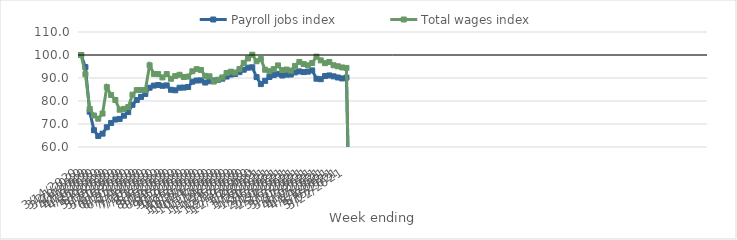
| Category | Payroll jobs index | Total wages index |
|---|---|---|
| 14/03/2020 | 100 | 100 |
| 21/03/2020 | 94.737 | 91.642 |
| 28/03/2020 | 75.344 | 76.601 |
| 04/04/2020 | 67.303 | 73.693 |
| 11/04/2020 | 64.792 | 72.305 |
| 18/04/2020 | 65.799 | 74.532 |
| 25/04/2020 | 68.594 | 86.015 |
| 02/05/2020 | 70.455 | 82.592 |
| 09/05/2020 | 71.943 | 80.434 |
| 16/05/2020 | 72.205 | 76.199 |
| 23/05/2020 | 73.607 | 76.57 |
| 30/05/2020 | 75.17 | 77.343 |
| 06/06/2020 | 78.346 | 82.746 |
| 13/06/2020 | 80.412 | 84.733 |
| 20/06/2020 | 81.77 | 84.733 |
| 27/06/2020 | 83.057 | 84.734 |
| 04/07/2020 | 85.779 | 95.514 |
| 11/07/2020 | 86.699 | 91.782 |
| 18/07/2020 | 86.941 | 91.709 |
| 25/07/2020 | 86.62 | 90.257 |
| 01/08/2020 | 86.783 | 91.724 |
| 08/08/2020 | 84.884 | 89.659 |
| 15/08/2020 | 84.65 | 90.83 |
| 22/08/2020 | 85.775 | 91.41 |
| 29/08/2020 | 85.836 | 90.417 |
| 05/09/2020 | 86.07 | 90.617 |
| 12/09/2020 | 88.4 | 92.918 |
| 19/09/2020 | 88.911 | 93.858 |
| 26/09/2020 | 88.973 | 93.49 |
| 03/10/2020 | 88.02 | 90.94 |
| 10/10/2020 | 88.612 | 90.73 |
| 17/10/2020 | 88.919 | 88.45 |
| 24/10/2020 | 89.153 | 89.222 |
| 31/10/2020 | 89.703 | 90.254 |
| 07/11/2020 | 90.628 | 92.21 |
| 14/11/2020 | 91.5 | 92.749 |
| 21/11/2020 | 91.749 | 92.357 |
| 28/11/2020 | 92.559 | 93.867 |
| 05/12/2020 | 93.59 | 96.571 |
| 12/12/2020 | 94.492 | 98.488 |
| 19/12/2020 | 94.662 | 100.116 |
| 26/12/2020 | 90.4 | 97.278 |
| 02/01/2021 | 87.343 | 98.248 |
| 09/01/2021 | 88.759 | 93.59 |
| 16/01/2021 | 90.441 | 92.947 |
| 23/01/2021 | 91.246 | 93.87 |
| 30/01/2021 | 91.827 | 95.472 |
| 06/02/2021 | 91.087 | 93.436 |
| 13/02/2021 | 91.463 | 93.679 |
| 20/02/2021 | 91.515 | 93.194 |
| 27/02/2021 | 92.439 | 95.267 |
| 06/03/2021 | 92.865 | 96.996 |
| 13/03/2021 | 92.564 | 96.073 |
| 20/03/2021 | 92.769 | 95.504 |
| 27/03/2021 | 93.308 | 96.518 |
| 03/04/2021 | 89.687 | 99.288 |
| 10/04/2021 | 89.487 | 97.662 |
| 17/04/2021 | 90.839 | 96.436 |
| 24/04/2021 | 91.12 | 96.964 |
| 01/05/2021 | 90.715 | 95.525 |
| 08/05/2021 | 90.222 | 95.084 |
| 15/05/2021 | 89.816 | 94.579 |
| 22/05/2021 | 90.166 | 94.389 |